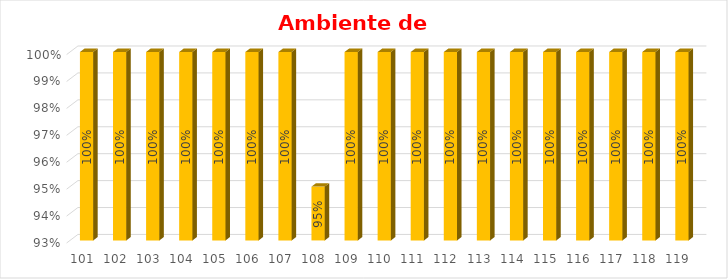
| Category | % Avance |
|---|---|
| 101.0 | 1 |
| 102.0 | 1 |
| 103.0 | 1 |
| 104.0 | 1 |
| 105.0 | 1 |
| 106.0 | 1 |
| 107.0 | 1 |
| 108.0 | 0.95 |
| 109.0 | 1 |
| 110.0 | 1 |
| 111.0 | 1 |
| 112.0 | 1 |
| 113.0 | 1 |
| 114.0 | 1 |
| 115.0 | 1 |
| 116.0 | 1 |
| 117.0 | 1 |
| 118.0 | 1 |
| 119.0 | 1 |